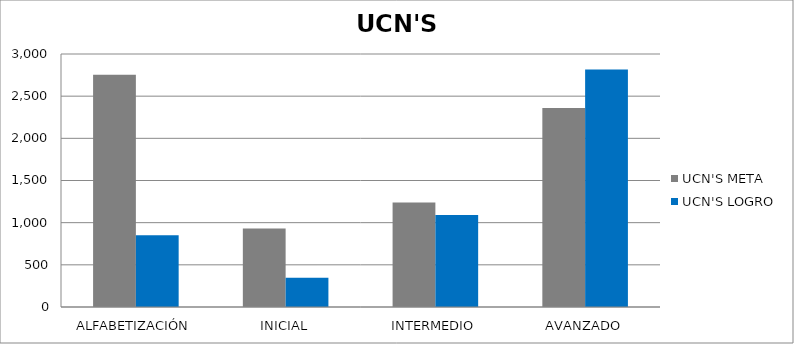
| Category | UCN'S |
|---|---|
| ALFABETIZACIÓN | 851 |
| INICIAL | 346 |
| INTERMEDIO | 1090 |
| AVANZADO | 2817 |